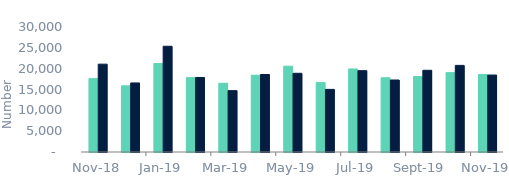
| Category | Full market | Remortgage No Equity Withdrawn |
|---|---|---|
| 2018-11-01 | 17610 | 21080 |
| 2018-12-01 | 15880 | 16570 |
| 2019-01-01 | 21240 | 25380 |
| 2019-02-01 | 17850 | 17890 |
| 2019-03-01 | 16500 | 14730 |
| 2019-04-01 | 18430 | 18600 |
| 2019-05-01 | 20600 | 18890 |
| 2019-06-01 | 16660 | 15030 |
| 2019-07-01 | 19930 | 19520 |
| 2019-08-01 | 17820 | 17280 |
| 2019-09-01 | 18100 | 19610 |
| 2019-10-01 | 19050 | 20790 |
| 2019-11-01 | 18610 | 18470 |